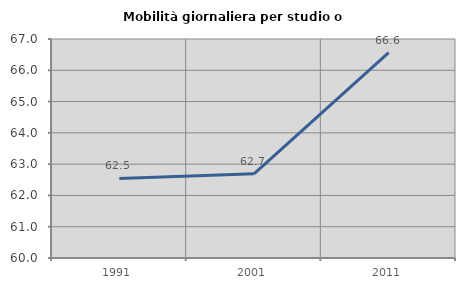
| Category | Mobilità giornaliera per studio o lavoro |
|---|---|
| 1991.0 | 62.544 |
| 2001.0 | 62.692 |
| 2011.0 | 66.561 |